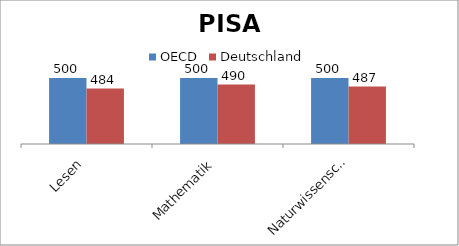
| Category | OECD | Deutschland |
|---|---|---|
| Lesen | 500 | 484 |
| Mathematik | 500 | 490 |
| Naturwissenschaften | 500 | 487 |